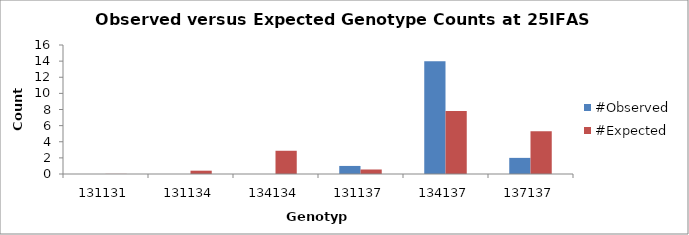
| Category | #Observed | #Expected |
|---|---|---|
| 131131.0 | 0 | 0.015 |
| 131134.0 | 0 | 0.412 |
| 134134.0 | 0 | 2.882 |
| 131137.0 | 1 | 0.559 |
| 134137.0 | 14 | 7.824 |
| 137137.0 | 2 | 5.309 |